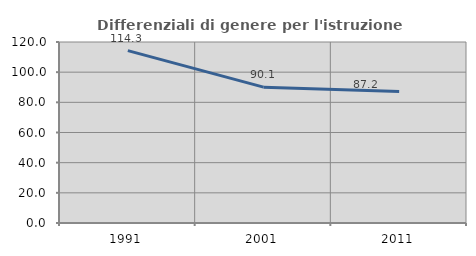
| Category | Differenziali di genere per l'istruzione superiore |
|---|---|
| 1991.0 | 114.268 |
| 2001.0 | 90.058 |
| 2011.0 | 87.223 |